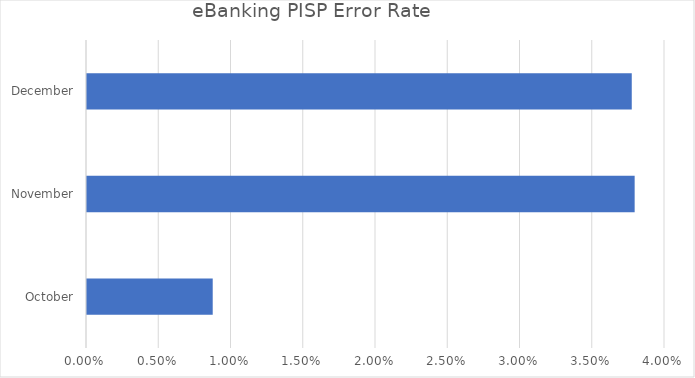
| Category | eBanking |
|---|---|
| October | 0.009 |
| November | 0.038 |
| December | 0.038 |